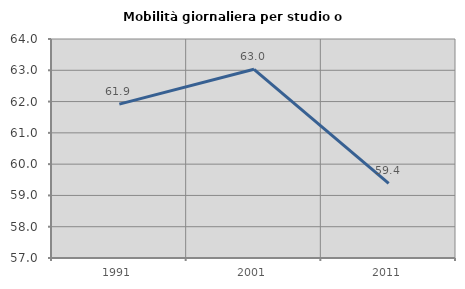
| Category | Mobilità giornaliera per studio o lavoro |
|---|---|
| 1991.0 | 61.918 |
| 2001.0 | 63.032 |
| 2011.0 | 59.382 |